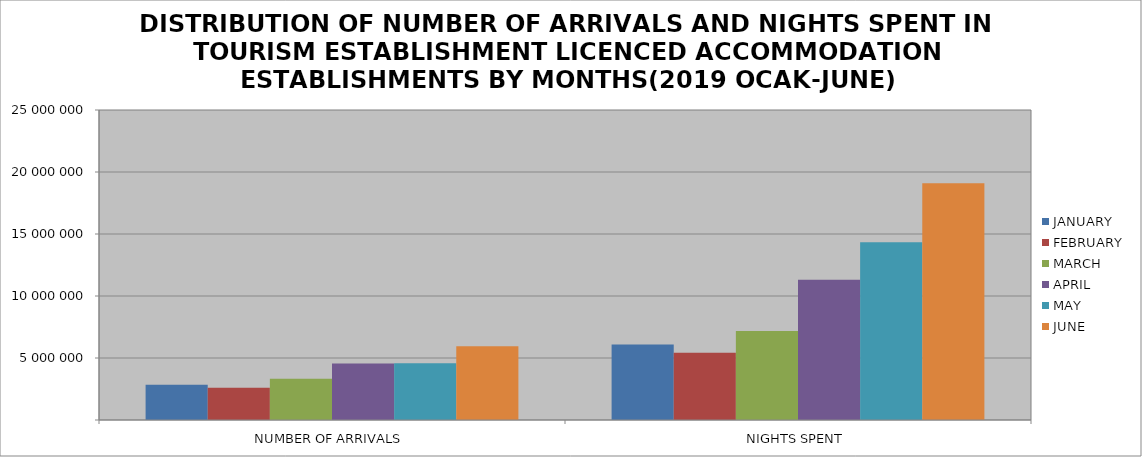
| Category | JANUARY | FEBRUARY | MARCH | APRIL | MAY | JUNE |
|---|---|---|---|---|---|---|
| NUMBER OF ARRIVALS | 2833509 | 2607189 | 3326719 | 4561709 | 4585981 | 5949977 |
| NIGHTS SPENT | 6098050 | 5425989 | 7182593 | 11302946 | 14338328 | 19092571 |